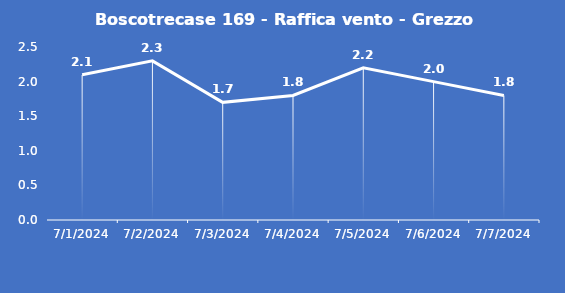
| Category | Boscotrecase 169 - Raffica vento - Grezzo (m/s) |
|---|---|
| 7/1/24 | 2.1 |
| 7/2/24 | 2.3 |
| 7/3/24 | 1.7 |
| 7/4/24 | 1.8 |
| 7/5/24 | 2.2 |
| 7/6/24 | 2 |
| 7/7/24 | 1.8 |